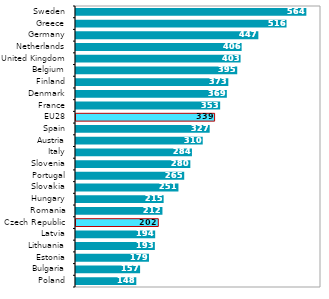
| Category |  2016 |
|---|---|
| Poland | 147.712 |
| Bulgaria | 156.966 |
| Estonia | 178.731 |
| Lithuania | 193.107 |
| Latvia | 193.91 |
| Czech Republic | 201.576 |
| Romania | 211.692 |
| Hungary | 214.598 |
| Slovakia | 250.873 |
| Portugal | 265.034 |
| Slovenia | 280.013 |
| Italy | 283.952 |
| Austria | 310.363 |
| Spain | 327.368 |
| EU28 | 339.43 |
| France | 353.062 |
| Denmark | 369.39 |
| Finland | 373.043 |
| Belgium | 394.833 |
| United Kingdom | 403.007 |
| Netherlands | 405.616 |
| Germany | 446.592 |
| Greece | 515.554 |
| Sweden | 564.124 |